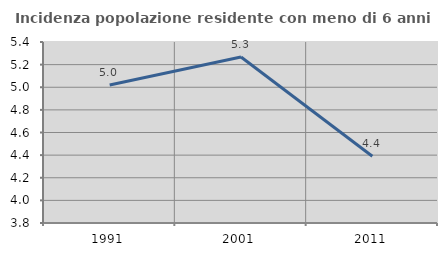
| Category | Incidenza popolazione residente con meno di 6 anni |
|---|---|
| 1991.0 | 5.021 |
| 2001.0 | 5.267 |
| 2011.0 | 4.391 |